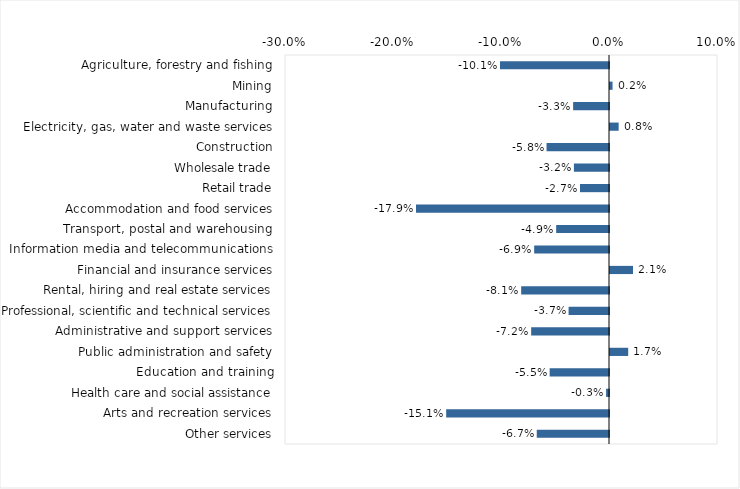
| Category | This week |
|---|---|
| Agriculture, forestry and fishing | -0.101 |
| Mining | 0.002 |
| Manufacturing | -0.033 |
| Electricity, gas, water and waste services | 0.008 |
| Construction | -0.058 |
| Wholesale trade | -0.032 |
| Retail trade | -0.027 |
| Accommodation and food services | -0.179 |
| Transport, postal and warehousing | -0.049 |
| Information media and telecommunications | -0.069 |
| Financial and insurance services | 0.021 |
| Rental, hiring and real estate services | -0.081 |
| Professional, scientific and technical services | -0.037 |
| Administrative and support services | -0.072 |
| Public administration and safety | 0.017 |
| Education and training | -0.055 |
| Health care and social assistance | -0.003 |
| Arts and recreation services | -0.151 |
| Other services | -0.067 |